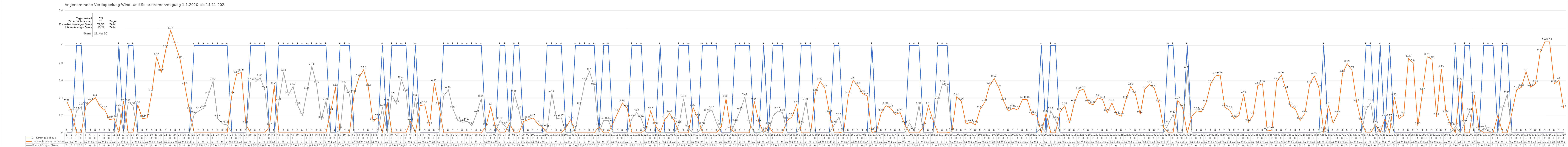
| Category | 1 =Strom reicht aus | Zusätzlich benötigter Strom | Überschüssiger Strom |
|---|---|---|---|
| 0 | 0 | 0.35 | 0 |
| 1 | 0 | 0.23 | 0 |
| 2 | 1 | 0 | 0.25 |
| 3 | 1 | 0 | 0.3 |
| 4 | 0 | 0.31 | 0 |
| 5 | 0 | 0.36 | 0 |
| 6 | 0 | 0.4 | 0 |
| 7 | 0 | 0.3 | 0 |
| 8 | 0 | 0.26 | 0 |
| 9 | 0 | 0.15 | 0 |
| 10 | 0 | 0.16 | 0 |
| 11 | 1 | 0 | 0.29 |
| 12 | 0 | 0.36 | 0 |
| 13 | 1 | 0 | 0.35 |
| 14 | 1 | 0 | 0.31 |
| 15 | 0 | 0.32 | 0 |
| 16 | 0 | 0.16 | 0 |
| 17 | 0 | 0.17 | 0 |
| 18 | 0 | 0.46 | 0 |
| 19 | 0 | 0.87 | 0 |
| 20 | 0 | 0.69 | 0 |
| 21 | 0 | 0.96 | 0 |
| 22 | 0 | 1.17 | 0 |
| 23 | 0 | 1.01 | 0 |
| 24 | 0 | 0.84 | 0 |
| 25 | 0 | 0.54 | 0 |
| 26 | 0 | 0.25 | 0 |
| 27 | 1 | 0 | 0.21 |
| 28 | 1 | 0 | 0.25 |
| 29 | 1 | 0 | 0.28 |
| 30 | 1 | 0 | 0.43 |
| 31 | 1 | 0 | 0.59 |
| 32 | 1 | 0 | 0.16 |
| 33 | 1 | 0 | 0.1 |
| 34 | 1 | 0 | 0.09 |
| 35 | 0 | 0.43 | 0 |
| 36 | 0 | 0.67 | 0 |
| 37 | 0 | 0.69 | 0 |
| 38 | 0 | 0.09 | 0 |
| 39 | 1 | 0 | 0.58 |
| 40 | 1 | 0 | 0.58 |
| 41 | 1 | 0 | 0.63 |
| 42 | 1 | 0 | 0.49 |
| 43 | 0 | 0.07 | 0 |
| 44 | 0 | 0.54 | 0 |
| 45 | 1 | 0 | 0.36 |
| 46 | 1 | 0 | 0.69 |
| 47 | 1 | 0 | 0.43 |
| 48 | 1 | 0 | 0.53 |
| 49 | 1 | 0 | 0.31 |
| 50 | 1 | 0 | 0.2 |
| 51 | 1 | 0 | 0.48 |
| 52 | 1 | 0 | 0.76 |
| 53 | 1 | 0 | 0.55 |
| 54 | 1 | 0 | 0.15 |
| 55 | 1 | 0 | 0.36 |
| 56 | 0 | 0.24 | 0 |
| 57 | 0 | 0.52 | 0 |
| 58 | 1 | 0 | 0.03 |
| 59 | 1 | 0 | 0.55 |
| 60 | 1 | 0 | 0.44 |
| 61 | 0 | 0.45 | 0 |
| 62 | 0 | 0.63 | 0 |
| 63 | 0 | 0.72 | 0 |
| 64 | 0 | 0.52 | 0 |
| 65 | 0 | 0.13 | 0 |
| 66 | 0 | 0.17 | 0 |
| 67 | 1 | 0 | 0.29 |
| 68 | 0 | 0.35 | 0 |
| 69 | 1 | 0 | 0.43 |
| 70 | 1 | 0 | 0.33 |
| 71 | 1 | 0 | 0.61 |
| 72 | 1 | 0 | 0.46 |
| 73 | 0 | 0.13 | 0 |
| 74 | 1 | 0 | 0.4 |
| 75 | 0 | 0.31 | 0 |
| 76 | 0 | 0.32 | 0 |
| 77 | 0 | 0.08 | 0 |
| 78 | 0 | 0.57 | 0 |
| 79 | 0 | 0.31 | 0 |
| 80 | 1 | 0 | 0.42 |
| 81 | 1 | 0 | 0.49 |
| 82 | 1 | 0 | 0.27 |
| 83 | 1 | 0 | 0.14 |
| 84 | 1 | 0 | 0.12 |
| 85 | 1 | 0 | 0.13 |
| 86 | 1 | 0 | 0.08 |
| 87 | 1 | 0 | 0.22 |
| 88 | 1 | 0 | 0.39 |
| 89 | 0 | 0.07 | 0 |
| 90 | 0 | 0.3 | 0 |
| 91 | 0 | 0.06 | 0 |
| 92 | 1 | 0 | 0.14 |
| 93 | 1 | 0 | 0.08 |
| 94 | 0 | 0.11 | 0 |
| 95 | 1 | 0 | 0.45 |
| 96 | 1 | 0 | 0.26 |
| 97 | 0 | 0.13 | 0 |
| 98 | 0 | 0.15 | 0 |
| 99 | 0 | 0.17 | 0 |
| 100 | 0 | 0.1 | 0 |
| 101 | 0 | 0.06 | 0 |
| 102 | 1 | 0 | 0.05 |
| 103 | 1 | 0 | 0.45 |
| 104 | 1 | 0 | 0.16 |
| 105 | 1 | 0 | 0.17 |
| 106 | 0 | 0.06 | 0 |
| 107 | 0 | 0.15 | 0 |
| 108 | 1 | 0 | 0.05 |
| 109 | 1 | 0 | 0.31 |
| 110 | 1 | 0 | 0.58 |
| 111 | 1 | 0 | 0.7 |
| 112 | 1 | 0 | 0.53 |
| 113 | 0 | 0.07 | 0 |
| 114 | 1 | 0 | 0.14 |
| 115 | 1 | 0 | 0.14 |
| 116 | 0 | 0.11 | 0 |
| 117 | 0 | 0.23 | 0 |
| 118 | 0 | 0.34 | 0 |
| 119 | 0 | 0.28 | 0 |
| 120 | 1 | 0 | 0.16 |
| 121 | 1 | 0 | 0.23 |
| 122 | 1 | 0 | 0.16 |
| 123 | 0 | 0.04 | 0 |
| 124 | 0 | 0.25 | 0 |
| 125 | 0 | 0.08 | 0 |
| 126 | 1 | 0 | 0 |
| 127 | 0 | 0.15 | 0 |
| 128 | 0 | 0.22 | 0 |
| 129 | 0 | 0.14 | 0 |
| 130 | 1 | 0 | 0.09 |
| 131 | 1 | 0 | 0.39 |
| 132 | 1 | 0 | 0.05 |
| 133 | 0 | 0.29 | 0 |
| 134 | 0 | 0.17 | 0 |
| 135 | 1 | 0 | 0.08 |
| 136 | 1 | 0 | 0.23 |
| 137 | 1 | 0 | 0.26 |
| 138 | 1 | 0 | 0.11 |
| 139 | 0 | 0.07 | 0 |
| 140 | 0 | 0.39 | 0 |
| 141 | 0 | 0.04 | 0 |
| 142 | 1 | 0 | 0.12 |
| 143 | 1 | 0 | 0.25 |
| 144 | 1 | 0 | 0.41 |
| 145 | 1 | 0 | 0.11 |
| 146 | 0 | 0.36 | 0 |
| 147 | 0 | 0.12 | 0 |
| 148 | 1 | 0 | 0.02 |
| 149 | 0 | 0.08 | 0 |
| 150 | 1 | 0 | 0.19 |
| 151 | 1 | 0 | 0.25 |
| 152 | 1 | 0 | 0.23 |
| 153 | 0 | 0.14 | 0 |
| 154 | 0 | 0.18 | 0 |
| 155 | 0 | 0.32 | 0 |
| 156 | 1 | 0 | 0.09 |
| 157 | 1 | 0 | 0.36 |
| 158 | 1 | 0 | 0 |
| 159 | 0 | 0.46 | 0 |
| 160 | 0 | 0.59 | 0 |
| 161 | 0 | 0.51 | 0 |
| 162 | 0 | 0.22 | 0 |
| 163 | 1 | 0 | 0.09 |
| 164 | 1 | 0 | 0.18 |
| 165 | 0 | 0.01 | 0 |
| 166 | 0 | 0.43 | 0 |
| 167 | 0 | 0.6 | 0 |
| 168 | 0 | 0.54 | 0 |
| 169 | 0 | 0.45 | 0 |
| 170 | 0 | 0.42 | 0 |
| 171 | 1 | 0 | 0.01 |
| 172 | 0 | 0.02 | 0 |
| 173 | 0 | 0.23 | 0 |
| 174 | 0 | 0.31 | 0 |
| 175 | 0 | 0.28 | 0 |
| 176 | 0 | 0.21 | 0 |
| 177 | 0 | 0.23 | 0 |
| 178 | 0 | 0.09 | 0 |
| 179 | 1 | 0 | 0.11 |
| 180 | 1 | 0 | 0.02 |
| 181 | 1 | 0 | 0.31 |
| 182 | 0 | 0.07 | 0 |
| 183 | 0 | 0.31 | 0 |
| 184 | 0 | 0.14 | 0 |
| 185 | 1 | 0 | 0.37 |
| 186 | 1 | 0 | 0.56 |
| 187 | 1 | 0 | 0.53 |
| 188 | 0 | 0.01 | 0 |
| 189 | 0 | 0.41 | 0 |
| 190 | 0 | 0.36 | 0 |
| 191 | 0 | 0.1 | 0 |
| 192 | 0 | 0.12 | 0 |
| 193 | 0 | 0.09 | 0 |
| 194 | 0 | 0.27 | 0 |
| 195 | 0 | 0.35 | 0 |
| 196 | 0 | 0.54 | 0 |
| 197 | 0 | 0.62 | 0 |
| 198 | 0 | 0.51 | 0 |
| 199 | 0 | 0.36 | 0 |
| 200 | 0 | 0.25 | 0 |
| 201 | 0 | 0.28 | 0 |
| 202 | 0 | 0.26 | 0 |
| 203 | 0 | 0.38 | 0 |
| 204 | 0 | 0.38 | 0 |
| 205 | 0 | 0.21 | 0 |
| 206 | 0 | 0.2 | 0 |
| 207 | 1 | 0 | 0.06 |
| 208 | 0 | 0.22 | 0 |
| 209 | 1 | 0 | 0.25 |
| 210 | 1 | 0 | 0.15 |
| 211 | 0 | 0.24 | 0 |
| 212 | 0 | 0.31 | 0 |
| 213 | 0 | 0.11 | 0 |
| 214 | 0 | 0.34 | 0 |
| 215 | 0 | 0.48 | 0 |
| 216 | 0 | 0.5 | 0 |
| 217 | 0 | 0.34 | 0 |
| 218 | 0 | 0.32 | 0 |
| 219 | 0 | 0.4 | 0 |
| 220 | 0 | 0.38 | 0 |
| 221 | 0 | 0.23 | 0 |
| 222 | 0 | 0.34 | 0 |
| 223 | 0 | 0.21 | 0 |
| 224 | 0 | 0.19 | 0 |
| 225 | 0 | 0.38 | 0 |
| 226 | 0 | 0.53 | 0 |
| 227 | 0 | 0.44 | 0 |
| 228 | 0 | 0.21 | 0 |
| 229 | 0 | 0.5 | 0 |
| 230 | 0 | 0.55 | 0 |
| 231 | 0 | 0.51 | 0 |
| 232 | 0 | 0.34 | 0 |
| 233 | 0 | 0.06 | 0 |
| 234 | 1 | 0 | 0.1 |
| 235 | 1 | 0 | 0.21 |
| 236 | 0 | 0.37 | 0 |
| 237 | 0 | 0.29 | 0 |
| 238 | 1 | 0 | 0.72 |
| 239 | 0 | 0.19 | 0 |
| 240 | 0 | 0.25 | 0 |
| 241 | 0 | 0.24 | 0 |
| 242 | 0 | 0.34 | 0 |
| 243 | 0 | 0.56 | 0 |
| 244 | 0 | 0.65 | 0 |
| 245 | 0 | 0.66 | 0 |
| 246 | 0 | 0.29 | 0 |
| 247 | 0 | 0.26 | 0 |
| 248 | 0 | 0.16 | 0 |
| 249 | 0 | 0.2 | 0 |
| 250 | 0 | 0.44 | 0 |
| 251 | 0 | 0.12 | 0 |
| 252 | 0 | 0.2 | 0 |
| 253 | 0 | 0.54 | 0 |
| 254 | 0 | 0.56 | 0 |
| 255 | 0 | 0.02 | 0 |
| 256 | 0 | 0.03 | 0 |
| 257 | 0 | 0.58 | 0 |
| 258 | 0 | 0.66 | 0 |
| 259 | 0 | 0.49 | 0 |
| 260 | 0 | 0.3 | 0 |
| 261 | 0 | 0.27 | 0 |
| 262 | 0 | 0.14 | 0 |
| 263 | 0 | 0.22 | 0 |
| 264 | 0 | 0.55 | 0 |
| 265 | 0 | 0.65 | 0 |
| 266 | 0 | 0.51 | 0 |
| 267 | 1 | 0 | 0.02 |
| 268 | 0 | 0.31 | 0 |
| 269 | 0 | 0.11 | 0 |
| 270 | 0 | 0.22 | 0 |
| 271 | 0 | 0.68 | 0 |
| 272 | 0 | 0.79 | 0 |
| 273 | 0 | 0.72 | 0 |
| 274 | 0 | 0.35 | 0 |
| 275 | 0 | 0.13 | 0 |
| 276 | 1 | 0 | 0.26 |
| 277 | 1 | 0 | 0.34 |
| 278 | 0 | 0.09 | 0 |
| 279 | 1 | 0 | 0.03 |
| 280 | 0 | 0.16 | 0 |
| 281 | 1 | 0 | 0.17 |
| 282 | 0 | 0.41 | 0 |
| 283 | 0 | 0.16 | 0 |
| 284 | 0 | 0.2 | 0 |
| 285 | 0 | 0.85 | 0 |
| 286 | 0 | 0.8 | 0 |
| 287 | 0 | 0.08 | 0 |
| 288 | 0 | 0.47 | 0 |
| 289 | 0 | 0.87 | 0 |
| 290 | 0 | 0.84 | 0 |
| 291 | 0 | 0.18 | 0 |
| 292 | 0 | 0.73 | 0 |
| 293 | 0 | 0.22 | 0 |
| 294 | 0 | 0.08 | 0 |
| 295 | 1 | 0 | 0.07 |
| 296 | 0 | 0.59 | 0 |
| 297 | 1 | 0 | 0.12 |
| 298 | 1 | 0 | 0.24 |
| 299 | 0 | 0.43 | 0 |
| 300 | 0 | 0.04 | 0 |
| 301 | 1 | 0 | 0.05 |
| 302 | 1 | 0 | 0.02 |
| 303 | 1 | 0 | 0 |
| 304 | 0 | 0.2 | 0 |
| 305 | 1 | 0 | 0.27 |
| 306 | 1 | 0 | 0.44 |
| 307 | 0 | 0.23 | 0 |
| 308 | 0 | 0.49 | 0 |
| 309 | 0 | 0.52 | 0 |
| 310 | 0 | 0.7 | 0 |
| 311 | 0 | 0.52 | 0 |
| 312 | 0 | 0.56 | 0 |
| 313 | 0 | 0.92 | 0 |
| 314 | 0 | 1.04 | 0 |
| 315 | 0 | 1.04 | 0 |
| 316 | 0 | 0.56 | 0 |
| 317 | 0 | 0.6 | 0 |
| 318 | 0 | 0.28 | 0 |